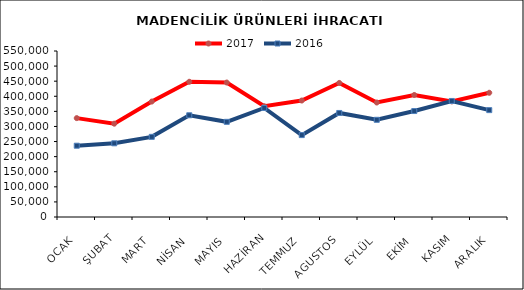
| Category | 2017 | 2016 |
|---|---|---|
| OCAK | 327636.032 | 236204.636 |
| ŞUBAT | 309155.177 | 244178.069 |
| MART | 382542.66 | 265568.229 |
| NİSAN | 447992.117 | 337034.798 |
| MAYIS | 445508.963 | 315280.372 |
| HAZİRAN | 366962.57 | 361234.934 |
| TEMMUZ | 385891.367 | 271362.799 |
| AGUSTOS | 444210.276 | 344705.86 |
| EYLÜL | 379294.923 | 322012.035 |
| EKİM | 404231.468 | 351089.667 |
| KASIM | 382981.876 | 384469.139 |
| ARALIK | 411603.089 | 354103.231 |